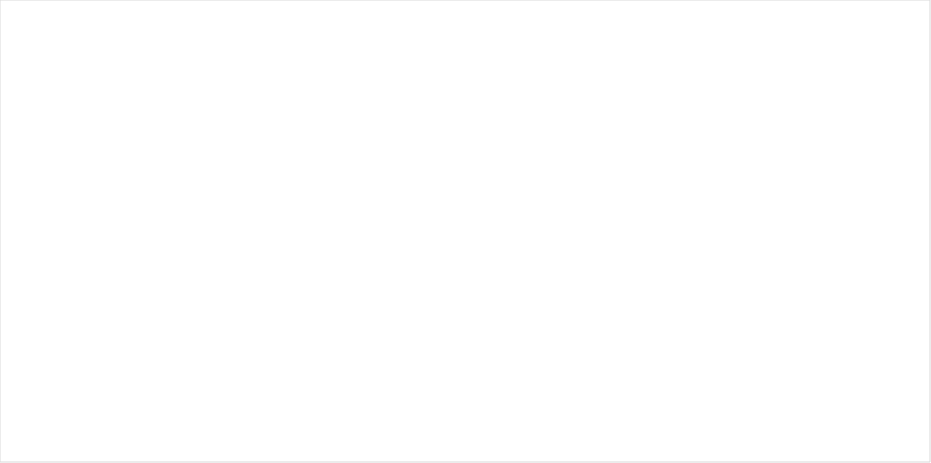
| Category |  APROPIACION
 VIGENTE |  COMPROMISOS
 ACUMULADOS |  OBLIGACIONES
 ACUMULADAS |  PAGOS
 ACUMULADOS |
|---|---|---|---|---|
| A-01 -GASTOS DE PERSONAL | 51464.345 | 3439.271 | 3439.271 | 2544.051 |
| A-02 -ADQUISICIÓN DE BIENES  Y SERVICIOS | 19419.071 | 12062.894 | 1580.277 | 1493.316 |
| A-03-TRANSFERENCIAS CORRIENTES | 14851.097 | 1.394 | 0 | 0 |
| A-08-GASTOS POR TRIBUTOS, MULTAS, SANCIONES E INTERESES DE MORA | 14051.472 | 0 | 0 | 0 |